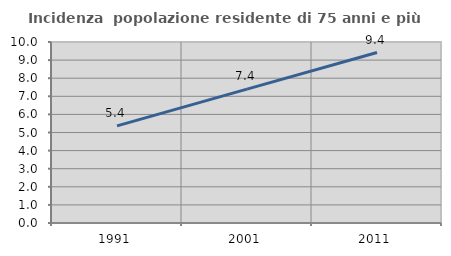
| Category | Incidenza  popolazione residente di 75 anni e più |
|---|---|
| 1991.0 | 5.368 |
| 2001.0 | 7.395 |
| 2011.0 | 9.417 |